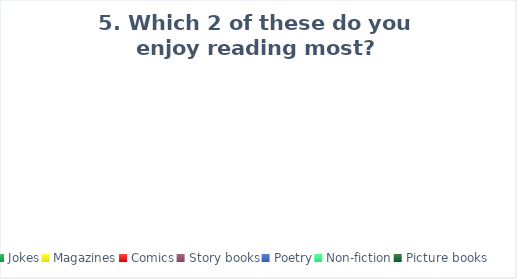
| Category | Series 0 |
|---|---|
| Jokes | 0 |
| Magazines | 0 |
| Comics | 0 |
| Story books | 0 |
| Poetry | 0 |
| Non-fiction | 0 |
| Picture books | 0 |